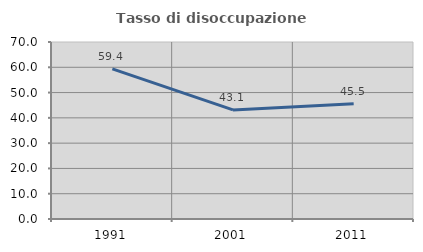
| Category | Tasso di disoccupazione giovanile  |
|---|---|
| 1991.0 | 59.358 |
| 2001.0 | 43.137 |
| 2011.0 | 45.545 |